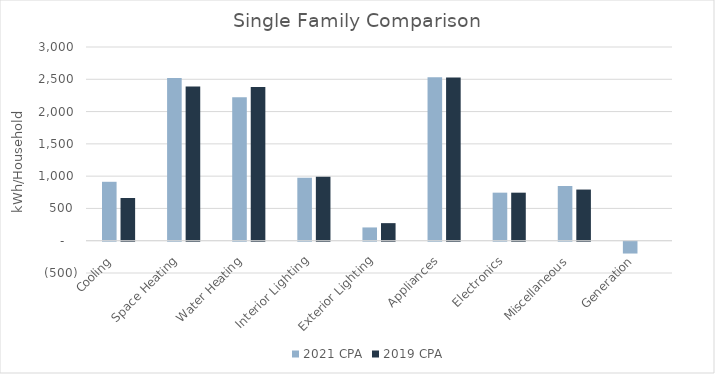
| Category | 2021 CPA | 2019 CPA |
|---|---|---|
| Cooling | 912.499 | 661.496 |
| Space Heating | 2518.624 | 2386.669 |
| Water Heating | 2223.464 | 2381.798 |
| Interior Lighting | 974.633 | 989.046 |
| Exterior Lighting | 205.575 | 272.192 |
| Appliances | 2530.397 | 2525.72 |
| Electronics | 744.16 | 743.924 |
| Miscellaneous | 846.96 | 792.267 |
| Generation | -183.088 | 0 |